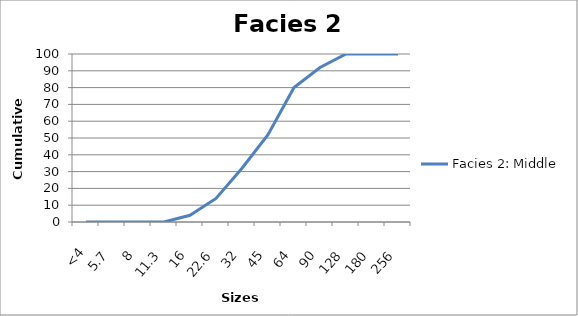
| Category | Facies 2: Middle |
|---|---|
| <4 | 0 |
| 5.7 | 0 |
| 8 | 0 |
| 11.3 | 0 |
| 16 | 4 |
| 22.6 | 14 |
| 32 | 32 |
| 45 | 52 |
| 64 | 80 |
| 90 | 92 |
| 128 | 100 |
| 180 | 100 |
| 256 | 100 |